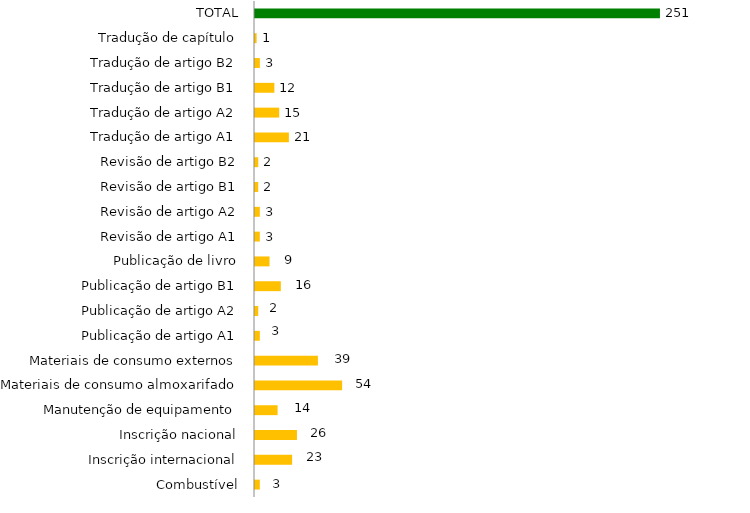
| Category | Series 1 |
|---|---|
| Combustível | 3 |
| Inscrição internacional | 23 |
| Inscrição nacional | 26 |
| Manutenção de equipamento | 14 |
| Materiais de consumo almoxarifado | 54 |
| Materiais de consumo externos | 39 |
| Publicação de artigo A1 | 3 |
| Publicação de artigo A2 | 2 |
| Publicação de artigo B1 | 16 |
| Publicação de livro | 9 |
| Revisão de artigo A1 | 3 |
| Revisão de artigo A2 | 3 |
| Revisão de artigo B1 | 2 |
| Revisão de artigo B2 | 2 |
| Tradução de artigo A1 | 21 |
| Tradução de artigo A2 | 15 |
| Tradução de artigo B1 | 12 |
| Tradução de artigo B2 | 3 |
| Tradução de capítulo | 1 |
| TOTAL | 251 |